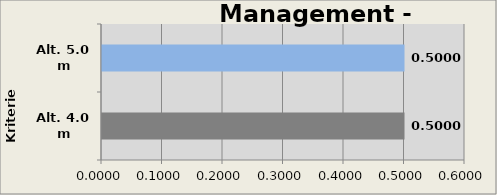
| Category | Management - B |
|---|---|
| Alt. 4.0 m | 0.5 |
| Alt. 5.0 m | 0.5 |